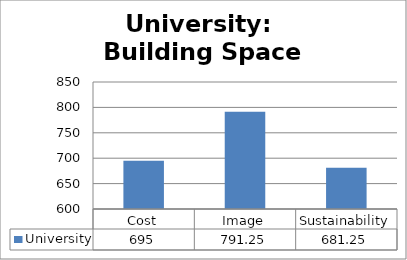
| Category | University |
|---|---|
| Cost | 695 |
| Image | 791.25 |
| Sustainability | 681.25 |